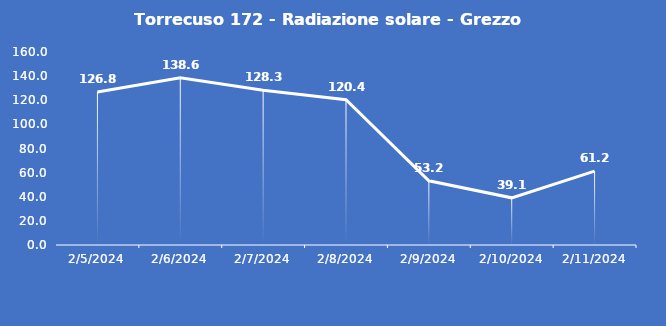
| Category | Torrecuso 172 - Radiazione solare - Grezzo (W/m2) |
|---|---|
| 2/5/24 | 126.8 |
| 2/6/24 | 138.6 |
| 2/7/24 | 128.3 |
| 2/8/24 | 120.4 |
| 2/9/24 | 53.2 |
| 2/10/24 | 39.1 |
| 2/11/24 | 61.2 |